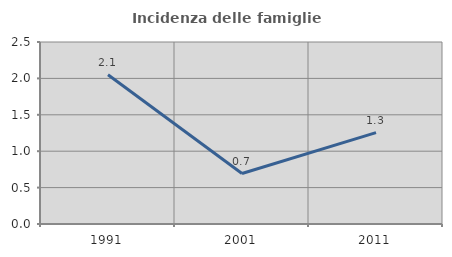
| Category | Incidenza delle famiglie numerose |
|---|---|
| 1991.0 | 2.051 |
| 2001.0 | 0.693 |
| 2011.0 | 1.255 |